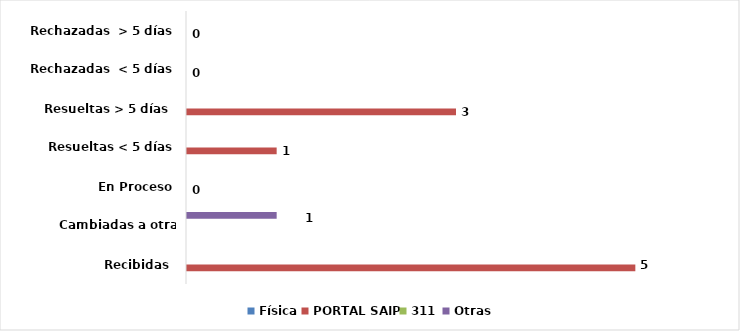
| Category | Física | PORTAL SAIP | 311 | Otras |
|---|---|---|---|---|
| Recibidas  | 0 | 5 | 0 | 0 |
| Cambiadas a otra institución | 0 | 0 | 0 | 1 |
| En Proceso | 0 | 0 | 0 | 0 |
| Resueltas < 5 días | 0 | 1 | 0 | 0 |
| Resueltas > 5 días  | 0 | 3 | 0 | 0 |
| Rechazadas  < 5 días | 0 | 0 | 0 | 0 |
| Rechazadas  > 5 días | 0 | 0 | 0 | 0 |